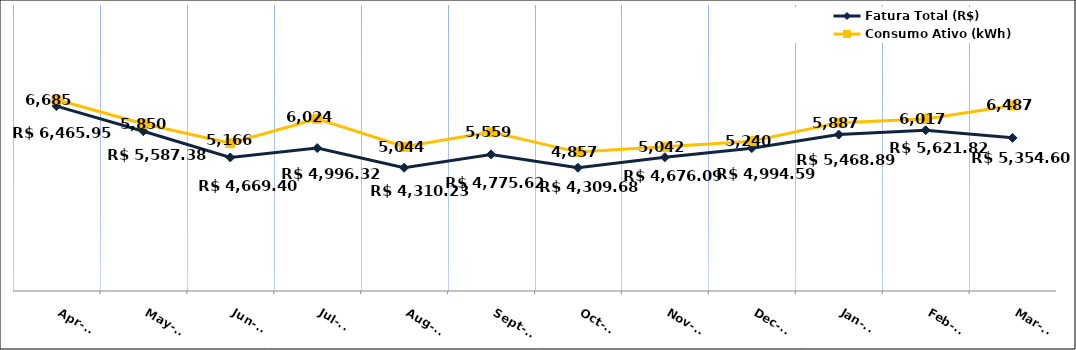
| Category | Fatura Total (R$) |
|---|---|
| 2023-04-01 | 6465.95 |
| 2023-05-01 | 5587.38 |
| 2023-06-01 | 4669.4 |
| 2023-07-01 | 4996.32 |
| 2023-08-01 | 4310.23 |
| 2023-09-01 | 4775.62 |
| 2023-10-01 | 4309.68 |
| 2023-11-01 | 4676.09 |
| 2023-12-01 | 4994.59 |
| 2024-01-01 | 5468.89 |
| 2024-02-01 | 5621.82 |
| 2024-03-01 | 5354.6 |